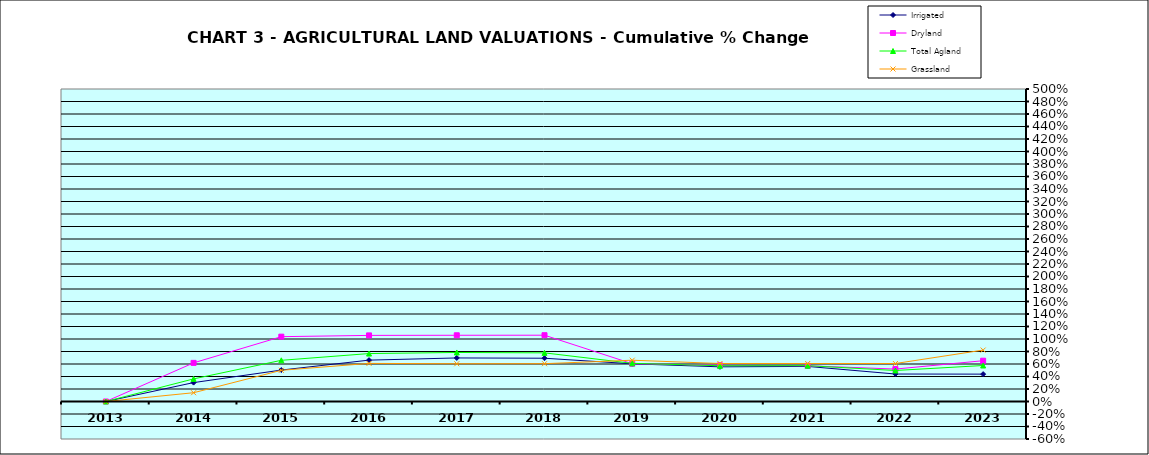
| Category | Irrigated | Dryland | Total Agland | Grassland |
|---|---|---|---|---|
| 2013.0 | 0 | 0 | 0 | 0 |
| 2014.0 | 0.302 | 0.618 | 0.362 | 0.14 |
| 2015.0 | 0.503 | 1.037 | 0.659 | 0.499 |
| 2016.0 | 0.662 | 1.058 | 0.767 | 0.61 |
| 2017.0 | 0.697 | 1.06 | 0.784 | 0.604 |
| 2018.0 | 0.692 | 1.061 | 0.778 | 0.605 |
| 2019.0 | 0.603 | 0.605 | 0.611 | 0.661 |
| 2020.0 | 0.555 | 0.579 | 0.572 | 0.608 |
| 2021.0 | 0.561 | 0.572 | 0.573 | 0.608 |
| 2022.0 | 0.44 | 0.519 | 0.496 | 0.608 |
| 2023.0 | 0.438 | 0.653 | 0.576 | 0.823 |